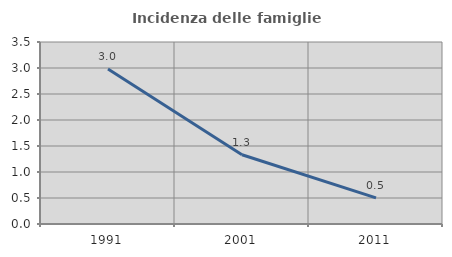
| Category | Incidenza delle famiglie numerose |
|---|---|
| 1991.0 | 2.982 |
| 2001.0 | 1.331 |
| 2011.0 | 0.503 |